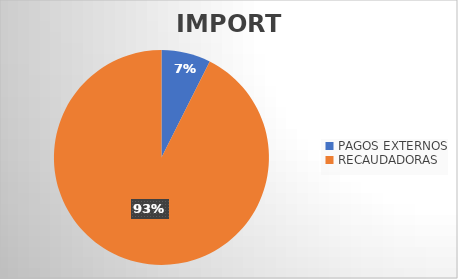
| Category | IMPORTE |
|---|---|
| PAGOS EXTERNOS | 16159012.89 |
| RECAUDADORAS | 201936559.62 |